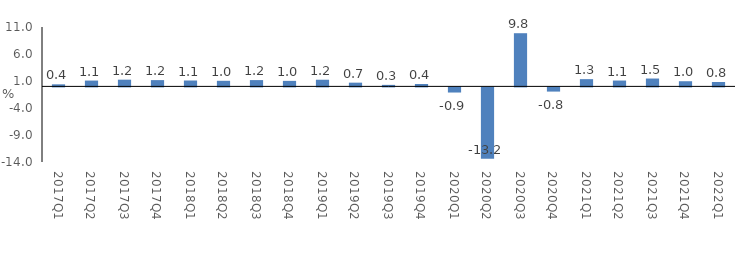
| Category | Series 0 |
|---|---|
| 2017Q1 | 0.383 |
| 2017Q2 | 1.08 |
| 2017Q3 | 1.244 |
| 2017Q4 | 1.165 |
| 2018Q1 | 1.092 |
| 2018Q2 | 1.037 |
| 2018Q3 | 1.168 |
| 2018Q4 | 1.024 |
| 2019Q1 | 1.234 |
| 2019Q2 | 0.692 |
| 2019Q3 | 0.282 |
| 2019Q4 | 0.447 |
| 2020Q1 | -0.95 |
| 2020Q2 | -13.217 |
| 2020Q3 | 9.85 |
| 2020Q4 | -0.776 |
| 2021Q1 | 1.343 |
| 2021Q2 | 1.086 |
| 2021Q3 | 1.457 |
| 2021Q4 | 0.958 |
| 2022Q1 | 0.811 |